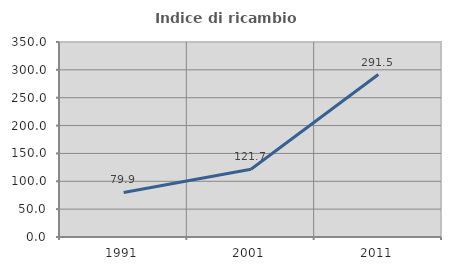
| Category | Indice di ricambio occupazionale  |
|---|---|
| 1991.0 | 79.945 |
| 2001.0 | 121.739 |
| 2011.0 | 291.533 |